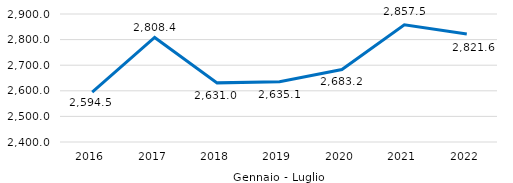
| Category | Series 0 |
|---|---|
| 0 | 2594.466 |
| 1 | 2808.402 |
| 2 | 2630.972 |
| 3 | 2635.124 |
| 4 | 2683.208 |
| 5 | 2857.495 |
| 6 | 2821.634 |